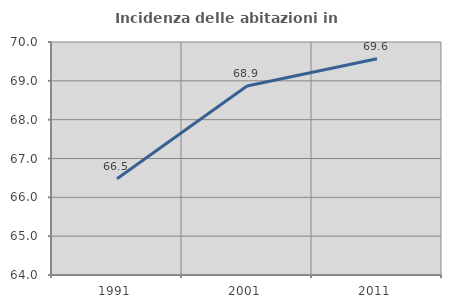
| Category | Incidenza delle abitazioni in proprietà  |
|---|---|
| 1991.0 | 66.48 |
| 2001.0 | 68.866 |
| 2011.0 | 69.569 |